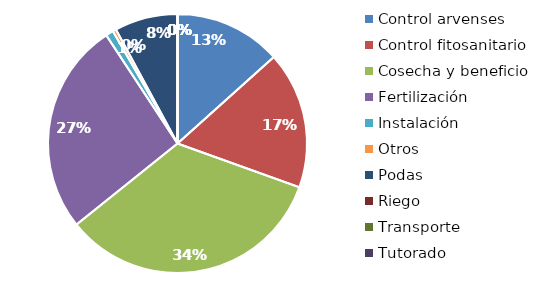
| Category | Valor |
|---|---|
| Control arvenses | 11430000 |
| Control fitosanitario | 14670000 |
| Cosecha y beneficio | 28881428.571 |
| Fertilización | 22680000 |
| Instalación | 821250 |
| Otros | 360000 |
| Podas | 6750000 |
| Riego | 0 |
| Transporte | 0 |
| Tutorado | 0 |